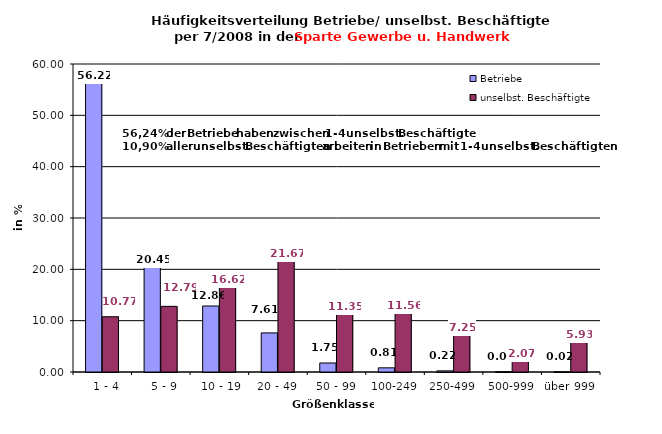
| Category | Betriebe | unselbst. Beschäftigte |
|---|---|---|
|   1 - 4 | 56.225 | 10.767 |
|   5 - 9 | 20.449 | 12.787 |
|  10 - 19 | 12.86 | 16.615 |
| 20 - 49 | 7.614 | 21.675 |
| 50 - 99 | 1.754 | 11.354 |
| 100-249 | 0.811 | 11.558 |
| 250-499 | 0.221 | 7.246 |
| 500-999 | 0.041 | 2.07 |
| über 999 | 0.025 | 5.929 |